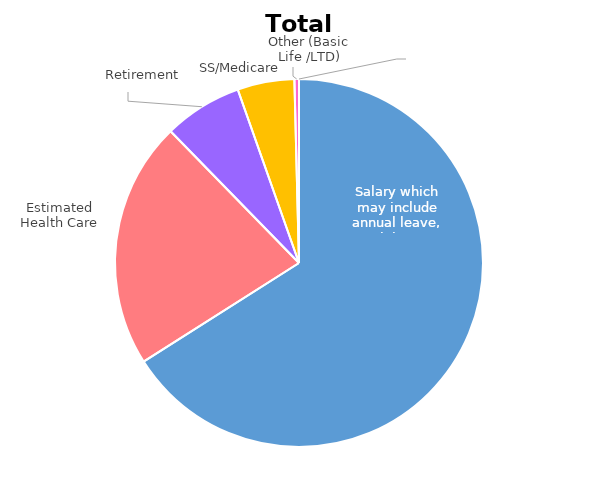
| Category | Series 0 |
|---|---|
| Salary which may include annual leave, sick leave, and holidays | 0.66 |
| Estimated Health Care | 0.217 |
| Retirement | 0.069 |
| SS/Medicare | 0.05 |
| Other (Basic Life /LTD) | 0.004 |